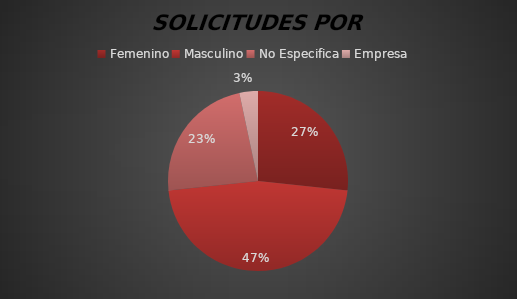
| Category | TOTAL |
|---|---|
| Femenino | 8 |
| Masculino | 14 |
| No Especifica | 7 |
| Empresa | 1 |